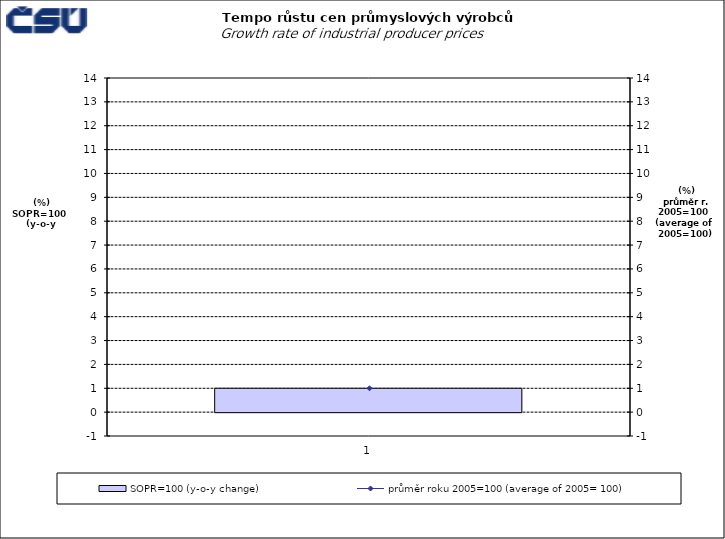
| Category | SOPR=100 (y-o-y change)   |
|---|---|
| 1.0 | 1 |